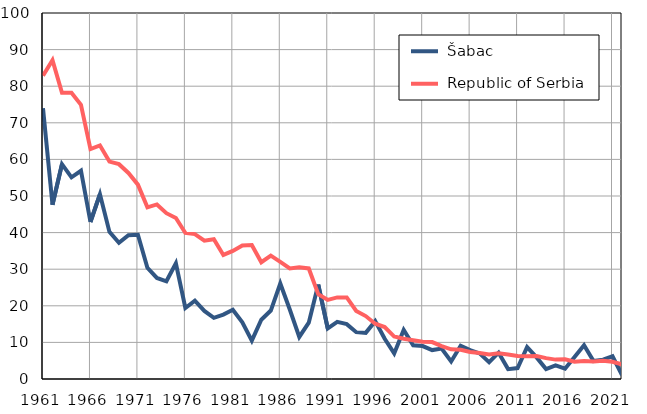
| Category |  Šabac |  Republic of Serbia |
|---|---|---|
| 1961.0 | 74 | 82.9 |
| 1962.0 | 47.6 | 87.1 |
| 1963.0 | 58.7 | 78.2 |
| 1964.0 | 55.1 | 78.2 |
| 1965.0 | 56.9 | 74.9 |
| 1966.0 | 42.9 | 62.8 |
| 1967.0 | 50.5 | 63.8 |
| 1968.0 | 40.2 | 59.4 |
| 1969.0 | 37.2 | 58.7 |
| 1970.0 | 39.3 | 56.3 |
| 1971.0 | 39.4 | 53.1 |
| 1972.0 | 30.4 | 46.9 |
| 1973.0 | 27.6 | 47.7 |
| 1974.0 | 26.7 | 45.3 |
| 1975.0 | 31.6 | 44 |
| 1976.0 | 19.4 | 39.9 |
| 1977.0 | 21.4 | 39.6 |
| 1978.0 | 18.6 | 37.8 |
| 1979.0 | 16.7 | 38.2 |
| 1980.0 | 17.6 | 33.9 |
| 1981.0 | 18.9 | 35 |
| 1982.0 | 15.5 | 36.5 |
| 1983.0 | 10.5 | 36.6 |
| 1984.0 | 16.2 | 31.9 |
| 1985.0 | 18.7 | 33.7 |
| 1986.0 | 26.1 | 32 |
| 1987.0 | 19 | 30.2 |
| 1988.0 | 11.5 | 30.5 |
| 1989.0 | 15.4 | 30.2 |
| 1990.0 | 25.8 | 23.2 |
| 1991.0 | 13.8 | 21.6 |
| 1992.0 | 15.6 | 22.3 |
| 1993.0 | 15 | 22.3 |
| 1994.0 | 12.8 | 18.6 |
| 1995.0 | 12.6 | 17.2 |
| 1996.0 | 15.8 | 15.1 |
| 1997.0 | 11 | 14.2 |
| 1998.0 | 7 | 11.6 |
| 1999.0 | 13.4 | 11 |
| 2000.0 | 9.2 | 10.6 |
| 2001.0 | 9 | 10.2 |
| 2002.0 | 7.9 | 10.1 |
| 2003.0 | 8.3 | 9 |
| 2004.0 | 4.8 | 8.1 |
| 2005.0 | 9.1 | 8 |
| 2006.0 | 7.9 | 7.4 |
| 2007.0 | 7 | 7.1 |
| 2008.0 | 4.6 | 6.7 |
| 2009.0 | 7.2 | 7 |
| 2010.0 | 2.7 | 6.7 |
| 2011.0 | 3 | 6.3 |
| 2012.0 | 8.7 | 6.2 |
| 2013.0 | 5.9 | 6.3 |
| 2014.0 | 2.7 | 5.7 |
| 2015.0 | 3.7 | 5.3 |
| 2016.0 | 2.8 | 5.4 |
| 2017.0 | 6 | 4.7 |
| 2018.0 | 9.2 | 4.9 |
| 2019.0 | 4.9 | 4.8 |
| 2020.0 | 5.3 | 5 |
| 2021.0 | 6.2 | 4.7 |
| 2022.0 | 1.1 | 4 |